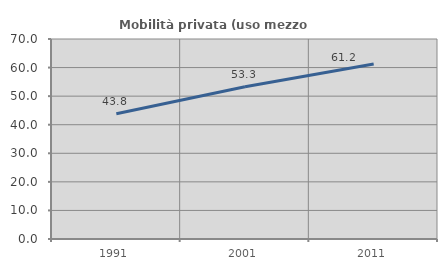
| Category | Mobilità privata (uso mezzo privato) |
|---|---|
| 1991.0 | 43.824 |
| 2001.0 | 53.276 |
| 2011.0 | 61.224 |